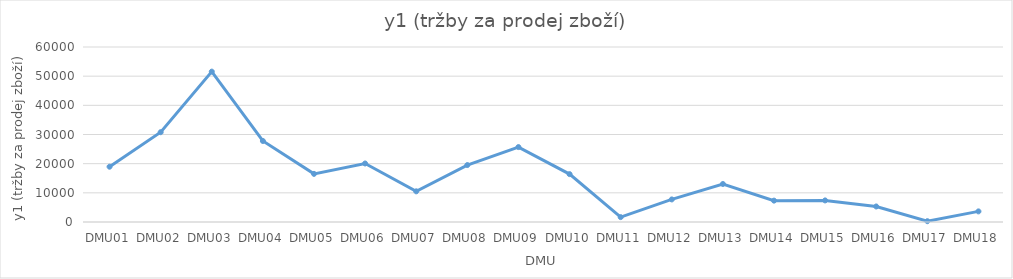
| Category | y1 (tržby za prodej zboží) |
|---|---|
| DMU01 | 18955 |
| DMU02 | 30786 |
| DMU03 | 51560 |
| DMU04 | 27773 |
| DMU05 | 16501 |
| DMU06 | 20062 |
| DMU07 | 10518 |
| DMU08 | 19528 |
| DMU09 | 25690 |
| DMU10 | 16416 |
| DMU11 | 1672 |
| DMU12 | 7738 |
| DMU13 | 13031 |
| DMU14 | 7326 |
| DMU15 | 7400 |
| DMU16 | 5325 |
| DMU17 | 276 |
| DMU18 | 3638 |